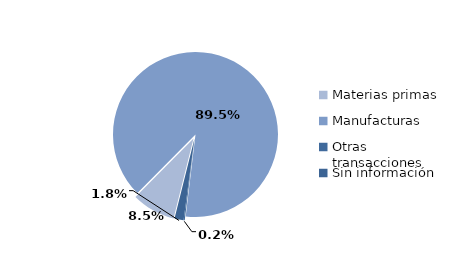
| Category | Series 0 |
|---|---|
| Materias primas | 1168.076 |
| Manufacturas | 12247.548 |
| Otras transacciones | 30.364 |
| Sin información | 242.387 |